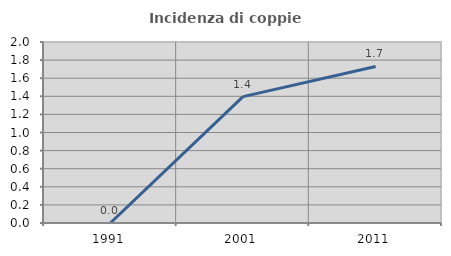
| Category | Incidenza di coppie miste |
|---|---|
| 1991.0 | 0 |
| 2001.0 | 1.397 |
| 2011.0 | 1.73 |